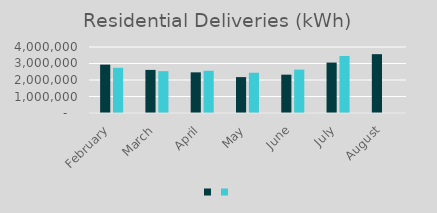
| Category | Series 1 | Series 0 |
|---|---|---|
| February | 2931022 | 2739688 |
| March | 2611486 | 2536769 |
| April | 2464085 | 2560197 |
| May | 2175066 | 2439036 |
| June | 2323720 | 2629934 |
| July | 3056084 | 3456641 |
| August | 3564883 | 0 |